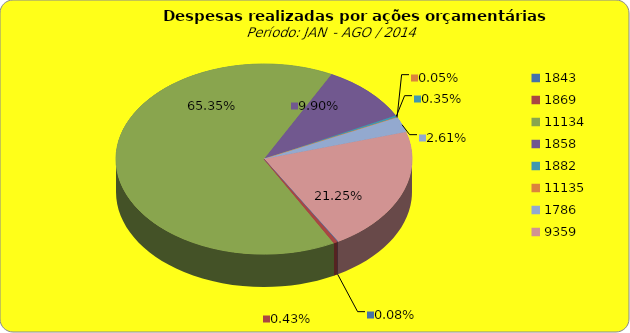
| Category | Series 1 |
|---|---|
| 1843.0 | 100000 |
| 1869.0 | 575052.99 |
| 11134.0 | 86663019.69 |
| 1858.0 | 13123375.76 |
| 1882.0 | 460659.2 |
| 11135.0 | 65839.25 |
| 1786.0 | 3454988.88 |
| 9359.0 | 28176938.69 |